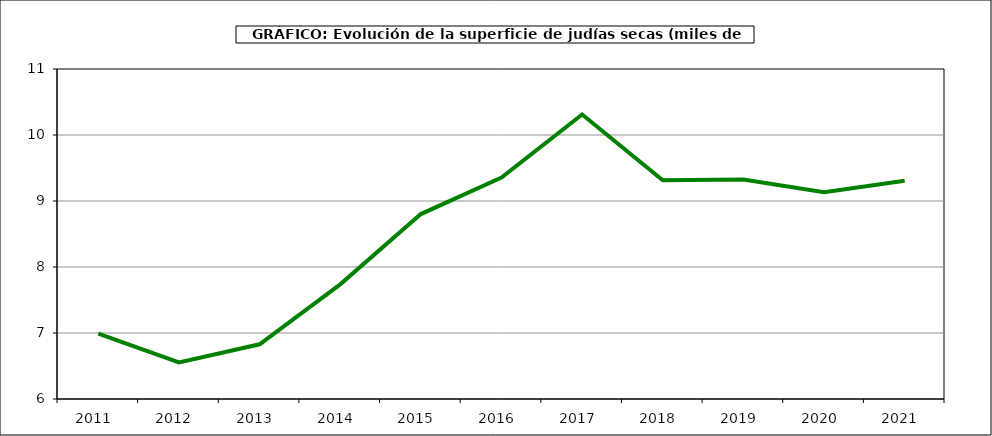
| Category | Superficie |
|---|---|
| 2011.0 | 6.989 |
| 2012.0 | 6.554 |
| 2013.0 | 6.829 |
| 2014.0 | 7.737 |
| 2015.0 | 8.802 |
| 2016.0 | 9.355 |
| 2017.0 | 10.31 |
| 2018.0 | 9.315 |
| 2019.0 | 9.326 |
| 2020.0 | 9.133 |
| 2021.0 | 9.307 |